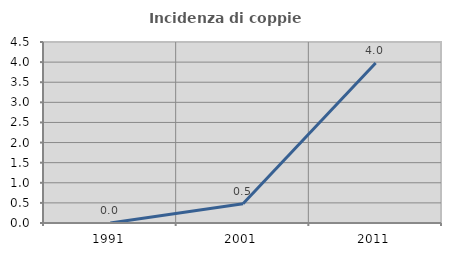
| Category | Incidenza di coppie miste |
|---|---|
| 1991.0 | 0 |
| 2001.0 | 0.478 |
| 2011.0 | 3.977 |